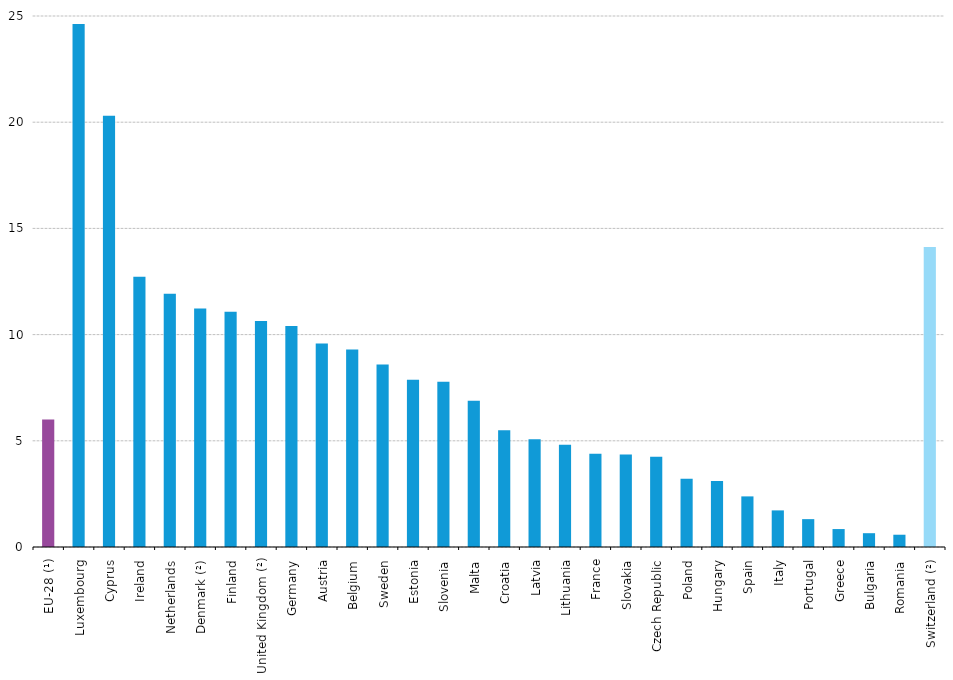
| Category | Series 0 |
|---|---|
| EU-28 (¹) | 5.999 |
| Luxembourg | 24.622 |
| Cyprus | 20.298 |
| Ireland | 12.727 |
| Netherlands | 11.927 |
| Denmark (²) | 11.228 |
| Finland | 11.078 |
| United Kingdom (²) | 10.646 |
| Germany | 10.407 |
| Austria | 9.584 |
| Belgium | 9.301 |
| Sweden | 8.59 |
| Estonia | 7.871 |
| Slovenia | 7.777 |
| Malta | 6.88 |
| Croatia | 5.499 |
| Latvia | 5.074 |
| Lithuania | 4.815 |
| France | 4.385 |
| Slovakia | 4.359 |
| Czech Republic | 4.255 |
| Poland | 3.21 |
| Hungary | 3.104 |
| Spain | 2.383 |
| Italy | 1.723 |
| Portugal | 1.311 |
| Greece | 0.845 |
| Bulgaria | 0.65 |
| Romania | 0.578 |
| Switzerland (²) | 14.13 |